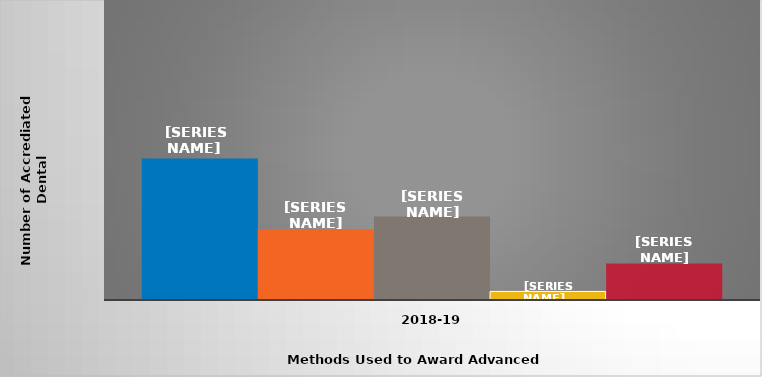
| Category | Transfer of credit | Equivalency examinations | Challenge examinations | Completion of non-accredited dental assisting program at institution | Other |
|---|---|---|---|---|---|
| 2018-19 | 66 | 33 | 39 | 4 | 17 |